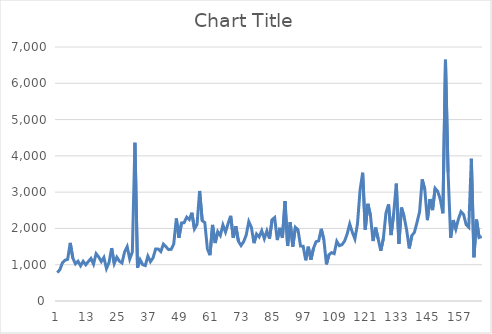
| Category | Series 0 |
|---|---|
| 0 | 781 |
| 1 | 865 |
| 2 | 1055 |
| 3 | 1125 |
| 4 | 1148 |
| 5 | 1602 |
| 6 | 1183 |
| 7 | 1025 |
| 8 | 1096 |
| 9 | 970 |
| 10 | 1094 |
| 11 | 997 |
| 12 | 1088 |
| 13 | 1172 |
| 14 | 1016 |
| 15 | 1304 |
| 16 | 1214 |
| 17 | 1087 |
| 18 | 1201 |
| 19 | 894 |
| 20 | 1062 |
| 21 | 1458 |
| 22 | 1033 |
| 23 | 1207 |
| 24 | 1098 |
| 25 | 1048 |
| 26 | 1352 |
| 27 | 1499 |
| 28 | 1157 |
| 29 | 1349 |
| 30 | 4361 |
| 31 | 920 |
| 32 | 1137 |
| 33 | 1001 |
| 34 | 976 |
| 35 | 1236 |
| 36 | 1084 |
| 37 | 1189 |
| 38 | 1432 |
| 39 | 1431 |
| 40 | 1363 |
| 41 | 1566 |
| 42 | 1494 |
| 43 | 1416 |
| 44 | 1425 |
| 45 | 1571 |
| 46 | 2274 |
| 47 | 1743 |
| 48 | 2151 |
| 49 | 2157 |
| 50 | 2310 |
| 51 | 2245 |
| 52 | 2433 |
| 53 | 1988 |
| 54 | 2111 |
| 55 | 3032 |
| 56 | 2216 |
| 57 | 2164 |
| 58 | 1433 |
| 59 | 1262 |
| 60 | 2096 |
| 61 | 1597 |
| 62 | 1911 |
| 63 | 1804 |
| 64 | 2094 |
| 65 | 1900 |
| 66 | 2132 |
| 67 | 2347 |
| 68 | 1740 |
| 69 | 2062 |
| 70 | 1644 |
| 71 | 1529 |
| 72 | 1633 |
| 73 | 1816 |
| 74 | 2190 |
| 75 | 2029 |
| 76 | 1595 |
| 77 | 1847 |
| 78 | 1766 |
| 79 | 1937 |
| 80 | 1716 |
| 81 | 1932 |
| 82 | 1719 |
| 83 | 2240 |
| 84 | 2300 |
| 85 | 1679 |
| 86 | 2016 |
| 87 | 1740 |
| 88 | 2756 |
| 89 | 1515 |
| 90 | 2176 |
| 91 | 1498 |
| 92 | 2031 |
| 93 | 1964 |
| 94 | 1513 |
| 95 | 1511 |
| 96 | 1122 |
| 97 | 1496 |
| 98 | 1135 |
| 99 | 1452 |
| 100 | 1635 |
| 101 | 1658 |
| 102 | 1989 |
| 103 | 1692 |
| 104 | 1010 |
| 105 | 1278 |
| 106 | 1334 |
| 107 | 1305 |
| 108 | 1645 |
| 109 | 1524 |
| 110 | 1551 |
| 111 | 1649 |
| 112 | 1844 |
| 113 | 2123 |
| 114 | 1895 |
| 115 | 1710 |
| 116 | 2127 |
| 117 | 3061 |
| 118 | 3535 |
| 119 | 1968 |
| 120 | 2678 |
| 121 | 2365 |
| 122 | 1652 |
| 123 | 2024 |
| 124 | 1709 |
| 125 | 1384 |
| 126 | 1724 |
| 127 | 2422 |
| 128 | 2661 |
| 129 | 1818 |
| 130 | 2419 |
| 131 | 3236 |
| 132 | 1574 |
| 133 | 2576 |
| 134 | 2327 |
| 135 | 1955 |
| 136 | 1449 |
| 137 | 1800 |
| 138 | 1891 |
| 139 | 2164 |
| 140 | 2462 |
| 141 | 3351 |
| 142 | 3077 |
| 143 | 2228 |
| 144 | 2809 |
| 145 | 2505 |
| 146 | 3104 |
| 147 | 3022 |
| 148 | 2798 |
| 149 | 2417 |
| 150 | 6648 |
| 151 | 3548 |
| 152 | 1742 |
| 153 | 2231 |
| 154 | 1981 |
| 155 | 2258 |
| 156 | 2461 |
| 157 | 2383 |
| 158 | 2102 |
| 159 | 2032 |
| 160 | 3922 |
| 161 | 1206 |
| 162 | 2245 |
| 163 | 1751 |
| 164 | 1777 |